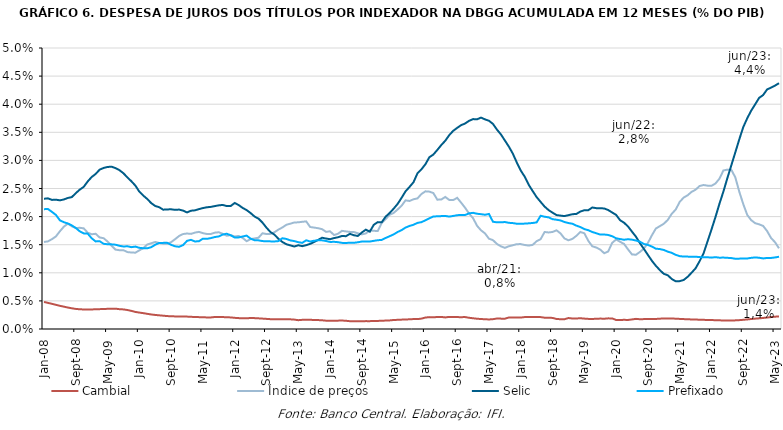
| Category | Cambial | Índice de preços | Selic | Prefixado |
|---|---|---|---|---|
| 2008-01-01 | 0.005 | 0.015 | 0.023 | 0.021 |
| 2008-02-01 | 0.005 | 0.016 | 0.023 | 0.021 |
| 2008-03-01 | 0.004 | 0.016 | 0.023 | 0.021 |
| 2008-04-01 | 0.004 | 0.016 | 0.023 | 0.02 |
| 2008-05-01 | 0.004 | 0.017 | 0.023 | 0.019 |
| 2008-06-01 | 0.004 | 0.018 | 0.023 | 0.019 |
| 2008-07-01 | 0.004 | 0.019 | 0.023 | 0.019 |
| 2008-08-01 | 0.004 | 0.018 | 0.023 | 0.018 |
| 2008-09-01 | 0.004 | 0.018 | 0.024 | 0.018 |
| 2008-10-01 | 0.004 | 0.018 | 0.025 | 0.017 |
| 2008-11-01 | 0.003 | 0.018 | 0.025 | 0.017 |
| 2008-12-01 | 0.003 | 0.017 | 0.026 | 0.017 |
| 2009-01-01 | 0.003 | 0.017 | 0.027 | 0.016 |
| 2009-02-01 | 0.004 | 0.017 | 0.028 | 0.016 |
| 2009-03-01 | 0.004 | 0.016 | 0.028 | 0.016 |
| 2009-04-01 | 0.004 | 0.016 | 0.029 | 0.015 |
| 2009-05-01 | 0.004 | 0.016 | 0.029 | 0.015 |
| 2009-06-01 | 0.004 | 0.015 | 0.029 | 0.015 |
| 2009-07-01 | 0.004 | 0.014 | 0.029 | 0.015 |
| 2009-08-01 | 0.004 | 0.014 | 0.028 | 0.015 |
| 2009-09-01 | 0.003 | 0.014 | 0.028 | 0.015 |
| 2009-10-01 | 0.003 | 0.014 | 0.027 | 0.015 |
| 2009-11-01 | 0.003 | 0.014 | 0.026 | 0.015 |
| 2009-12-01 | 0.003 | 0.014 | 0.026 | 0.015 |
| 2010-01-01 | 0.003 | 0.014 | 0.024 | 0.014 |
| 2010-02-01 | 0.003 | 0.014 | 0.024 | 0.014 |
| 2010-03-01 | 0.003 | 0.015 | 0.023 | 0.014 |
| 2010-04-01 | 0.003 | 0.015 | 0.022 | 0.015 |
| 2010-05-01 | 0.002 | 0.015 | 0.022 | 0.015 |
| 2010-06-01 | 0.002 | 0.015 | 0.022 | 0.015 |
| 2010-07-01 | 0.002 | 0.015 | 0.021 | 0.015 |
| 2010-08-01 | 0.002 | 0.015 | 0.021 | 0.015 |
| 2010-09-01 | 0.002 | 0.015 | 0.021 | 0.015 |
| 2010-10-01 | 0.002 | 0.016 | 0.021 | 0.015 |
| 2010-11-01 | 0.002 | 0.017 | 0.021 | 0.015 |
| 2010-12-01 | 0.002 | 0.017 | 0.021 | 0.015 |
| 2011-01-01 | 0.002 | 0.017 | 0.021 | 0.016 |
| 2011-02-01 | 0.002 | 0.017 | 0.021 | 0.016 |
| 2011-03-01 | 0.002 | 0.017 | 0.021 | 0.016 |
| 2011-04-01 | 0.002 | 0.017 | 0.021 | 0.016 |
| 2011-05-01 | 0.002 | 0.017 | 0.022 | 0.016 |
| 2011-06-01 | 0.002 | 0.017 | 0.022 | 0.016 |
| 2011-07-01 | 0.002 | 0.017 | 0.022 | 0.016 |
| 2011-08-01 | 0.002 | 0.017 | 0.022 | 0.016 |
| 2011-09-01 | 0.002 | 0.017 | 0.022 | 0.016 |
| 2011-10-01 | 0.002 | 0.017 | 0.022 | 0.017 |
| 2011-11-01 | 0.002 | 0.017 | 0.022 | 0.017 |
| 2011-12-01 | 0.002 | 0.017 | 0.022 | 0.017 |
| 2012-01-01 | 0.002 | 0.016 | 0.022 | 0.016 |
| 2012-02-01 | 0.002 | 0.017 | 0.022 | 0.016 |
| 2012-03-01 | 0.002 | 0.016 | 0.022 | 0.016 |
| 2012-04-01 | 0.002 | 0.016 | 0.021 | 0.017 |
| 2012-05-01 | 0.002 | 0.016 | 0.021 | 0.016 |
| 2012-06-01 | 0.002 | 0.016 | 0.02 | 0.016 |
| 2012-07-01 | 0.002 | 0.016 | 0.02 | 0.016 |
| 2012-08-01 | 0.002 | 0.017 | 0.019 | 0.016 |
| 2012-09-01 | 0.002 | 0.017 | 0.018 | 0.016 |
| 2012-10-01 | 0.002 | 0.017 | 0.017 | 0.016 |
| 2012-11-01 | 0.002 | 0.017 | 0.017 | 0.016 |
| 2012-12-01 | 0.002 | 0.018 | 0.016 | 0.016 |
| 2013-01-01 | 0.002 | 0.018 | 0.015 | 0.016 |
| 2013-02-01 | 0.002 | 0.019 | 0.015 | 0.016 |
| 2013-03-01 | 0.002 | 0.019 | 0.015 | 0.016 |
| 2013-04-01 | 0.002 | 0.019 | 0.015 | 0.016 |
| 2013-05-01 | 0.002 | 0.019 | 0.015 | 0.015 |
| 2013-06-01 | 0.002 | 0.019 | 0.015 | 0.015 |
| 2013-07-01 | 0.002 | 0.019 | 0.015 | 0.016 |
| 2013-08-01 | 0.002 | 0.018 | 0.015 | 0.016 |
| 2013-09-01 | 0.002 | 0.018 | 0.015 | 0.016 |
| 2013-10-01 | 0.002 | 0.018 | 0.016 | 0.016 |
| 2013-11-01 | 0.002 | 0.018 | 0.016 | 0.016 |
| 2013-12-01 | 0.001 | 0.017 | 0.016 | 0.016 |
| 2014-01-01 | 0.001 | 0.017 | 0.016 | 0.015 |
| 2014-02-01 | 0.001 | 0.017 | 0.016 | 0.016 |
| 2014-03-01 | 0.001 | 0.017 | 0.016 | 0.015 |
| 2014-04-01 | 0.002 | 0.017 | 0.017 | 0.015 |
| 2014-05-01 | 0.001 | 0.017 | 0.017 | 0.015 |
| 2014-06-01 | 0.001 | 0.017 | 0.017 | 0.015 |
| 2014-07-01 | 0.001 | 0.017 | 0.017 | 0.015 |
| 2014-08-01 | 0.001 | 0.017 | 0.017 | 0.015 |
| 2014-09-01 | 0.001 | 0.017 | 0.017 | 0.016 |
| 2014-10-01 | 0.001 | 0.017 | 0.018 | 0.016 |
| 2014-11-01 | 0.001 | 0.018 | 0.017 | 0.016 |
| 2014-12-01 | 0.001 | 0.017 | 0.019 | 0.016 |
| 2015-01-01 | 0.001 | 0.017 | 0.019 | 0.016 |
| 2015-02-01 | 0.001 | 0.019 | 0.019 | 0.016 |
| 2015-03-01 | 0.002 | 0.02 | 0.02 | 0.016 |
| 2015-04-01 | 0.002 | 0.02 | 0.021 | 0.017 |
| 2015-05-01 | 0.002 | 0.021 | 0.021 | 0.017 |
| 2015-06-01 | 0.002 | 0.021 | 0.022 | 0.017 |
| 2015-07-01 | 0.002 | 0.022 | 0.023 | 0.018 |
| 2015-08-01 | 0.002 | 0.023 | 0.024 | 0.018 |
| 2015-09-01 | 0.002 | 0.023 | 0.025 | 0.018 |
| 2015-10-01 | 0.002 | 0.023 | 0.026 | 0.019 |
| 2015-11-01 | 0.002 | 0.023 | 0.028 | 0.019 |
| 2015-12-01 | 0.002 | 0.024 | 0.028 | 0.019 |
| 2016-01-01 | 0.002 | 0.024 | 0.029 | 0.019 |
| 2016-02-01 | 0.002 | 0.024 | 0.031 | 0.02 |
| 2016-03-01 | 0.002 | 0.024 | 0.031 | 0.02 |
| 2016-04-01 | 0.002 | 0.023 | 0.032 | 0.02 |
| 2016-05-01 | 0.002 | 0.023 | 0.033 | 0.02 |
| 2016-06-01 | 0.002 | 0.023 | 0.033 | 0.02 |
| 2016-07-01 | 0.002 | 0.023 | 0.034 | 0.02 |
| 2016-08-01 | 0.002 | 0.023 | 0.035 | 0.02 |
| 2016-09-01 | 0.002 | 0.023 | 0.036 | 0.02 |
| 2016-10-01 | 0.002 | 0.022 | 0.036 | 0.02 |
| 2016-11-01 | 0.002 | 0.022 | 0.037 | 0.02 |
| 2016-12-01 | 0.002 | 0.021 | 0.037 | 0.021 |
| 2017-01-01 | 0.002 | 0.02 | 0.037 | 0.021 |
| 2017-02-01 | 0.002 | 0.018 | 0.037 | 0.021 |
| 2017-03-01 | 0.002 | 0.018 | 0.038 | 0.02 |
| 2017-04-01 | 0.002 | 0.017 | 0.037 | 0.02 |
| 2017-05-01 | 0.002 | 0.016 | 0.037 | 0.02 |
| 2017-06-01 | 0.002 | 0.016 | 0.036 | 0.019 |
| 2017-07-01 | 0.002 | 0.015 | 0.035 | 0.019 |
| 2017-08-01 | 0.002 | 0.015 | 0.035 | 0.019 |
| 2017-09-01 | 0.002 | 0.014 | 0.034 | 0.019 |
| 2017-10-01 | 0.002 | 0.015 | 0.032 | 0.019 |
| 2017-11-01 | 0.002 | 0.015 | 0.031 | 0.019 |
| 2017-12-01 | 0.002 | 0.015 | 0.03 | 0.019 |
| 2018-01-01 | 0.002 | 0.015 | 0.028 | 0.019 |
| 2018-02-01 | 0.002 | 0.015 | 0.027 | 0.019 |
| 2018-03-01 | 0.002 | 0.015 | 0.026 | 0.019 |
| 2018-04-01 | 0.002 | 0.015 | 0.025 | 0.019 |
| 2018-05-01 | 0.002 | 0.016 | 0.023 | 0.019 |
| 2018-06-01 | 0.002 | 0.016 | 0.023 | 0.02 |
| 2018-07-01 | 0.002 | 0.017 | 0.022 | 0.02 |
| 2018-08-01 | 0.002 | 0.017 | 0.021 | 0.02 |
| 2018-09-01 | 0.002 | 0.017 | 0.021 | 0.02 |
| 2018-10-01 | 0.002 | 0.018 | 0.02 | 0.019 |
| 2018-11-01 | 0.002 | 0.017 | 0.02 | 0.019 |
| 2018-12-01 | 0.002 | 0.016 | 0.02 | 0.019 |
| 2019-01-01 | 0.002 | 0.016 | 0.02 | 0.019 |
| 2019-02-01 | 0.002 | 0.016 | 0.02 | 0.019 |
| 2019-03-01 | 0.002 | 0.017 | 0.02 | 0.018 |
| 2019-04-01 | 0.002 | 0.017 | 0.021 | 0.018 |
| 2019-05-01 | 0.002 | 0.017 | 0.021 | 0.018 |
| 2019-06-01 | 0.002 | 0.016 | 0.021 | 0.018 |
| 2019-07-01 | 0.002 | 0.015 | 0.022 | 0.017 |
| 2019-08-01 | 0.002 | 0.014 | 0.022 | 0.017 |
| 2019-09-01 | 0.002 | 0.014 | 0.021 | 0.017 |
| 2019-10-01 | 0.002 | 0.013 | 0.021 | 0.017 |
| 2019-11-01 | 0.002 | 0.014 | 0.021 | 0.017 |
| 2019-12-01 | 0.002 | 0.015 | 0.021 | 0.017 |
| 2020-01-01 | 0.002 | 0.016 | 0.02 | 0.016 |
| 2020-02-01 | 0.002 | 0.016 | 0.019 | 0.016 |
| 2020-03-01 | 0.002 | 0.015 | 0.019 | 0.016 |
| 2020-04-01 | 0.002 | 0.014 | 0.018 | 0.016 |
| 2020-05-01 | 0.002 | 0.013 | 0.017 | 0.016 |
| 2020-06-01 | 0.002 | 0.013 | 0.016 | 0.016 |
| 2020-07-01 | 0.002 | 0.014 | 0.015 | 0.016 |
| 2020-08-01 | 0.002 | 0.014 | 0.014 | 0.015 |
| 2020-09-01 | 0.002 | 0.015 | 0.013 | 0.015 |
| 2020-10-01 | 0.002 | 0.017 | 0.012 | 0.015 |
| 2020-11-01 | 0.002 | 0.018 | 0.011 | 0.014 |
| 2020-12-01 | 0.002 | 0.018 | 0.01 | 0.014 |
| 2021-01-01 | 0.002 | 0.019 | 0.01 | 0.014 |
| 2021-02-01 | 0.002 | 0.019 | 0.01 | 0.014 |
| 2021-03-01 | 0.002 | 0.02 | 0.009 | 0.014 |
| 2021-04-01 | 0.002 | 0.021 | 0.008 | 0.013 |
| 2021-05-01 | 0.002 | 0.023 | 0.009 | 0.013 |
| 2021-06-01 | 0.002 | 0.023 | 0.009 | 0.013 |
| 2021-07-01 | 0.002 | 0.024 | 0.009 | 0.013 |
| 2021-08-01 | 0.002 | 0.024 | 0.01 | 0.013 |
| 2021-09-01 | 0.002 | 0.025 | 0.011 | 0.013 |
| 2021-10-01 | 0.002 | 0.025 | 0.012 | 0.013 |
| 2021-11-01 | 0.002 | 0.026 | 0.013 | 0.013 |
| 2021-12-01 | 0.002 | 0.026 | 0.016 | 0.013 |
| 2022-01-01 | 0.002 | 0.025 | 0.018 | 0.013 |
| 2022-02-01 | 0.002 | 0.026 | 0.02 | 0.013 |
| 2022-03-01 | 0.002 | 0.027 | 0.022 | 0.013 |
| 2022-04-01 | 0.002 | 0.028 | 0.024 | 0.013 |
| 2022-05-01 | 0.002 | 0.028 | 0.027 | 0.013 |
| 2022-06-01 | 0.002 | 0.028 | 0.029 | 0.013 |
| 2022-07-01 | 0.002 | 0.027 | 0.031 | 0.012 |
| 2022-08-01 | 0.002 | 0.024 | 0.034 | 0.013 |
| 2022-09-01 | 0.002 | 0.022 | 0.036 | 0.013 |
| 2022-10-01 | 0.002 | 0.02 | 0.037 | 0.013 |
| 2022-11-01 | 0.002 | 0.019 | 0.039 | 0.013 |
| 2022-12-01 | 0.002 | 0.019 | 0.04 | 0.013 |
| 2023-01-01 | 0.002 | 0.019 | 0.041 | 0.013 |
| 2023-02-01 | 0.002 | 0.018 | 0.042 | 0.013 |
| 2023-03-01 | 0.002 | 0.017 | 0.043 | 0.013 |
| 2023-04-01 | 0.002 | 0.016 | 0.043 | 0.013 |
| 2023-05-01 | 0.002 | 0.015 | 0.043 | 0.013 |
| 2023-06-01 | 0.002 | 0.014 | 0.044 | 0.013 |